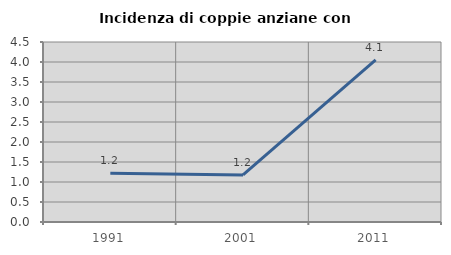
| Category | Incidenza di coppie anziane con figli |
|---|---|
| 1991.0 | 1.22 |
| 2001.0 | 1.176 |
| 2011.0 | 4.054 |